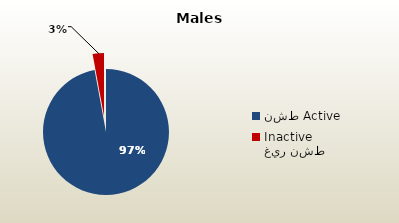
| Category | الذكور غير القطريين  Non-Qatari Males |
|---|---|
| نشط Active | 1660350 |
| غير نشط Inactive | 49617 |